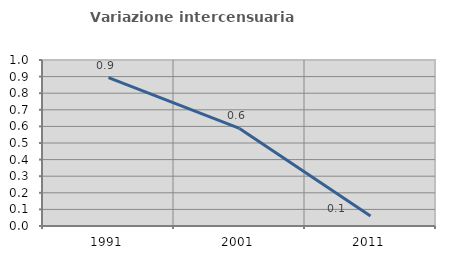
| Category | Variazione intercensuaria annua |
|---|---|
| 1991.0 | 0.894 |
| 2001.0 | 0.588 |
| 2011.0 | 0.06 |